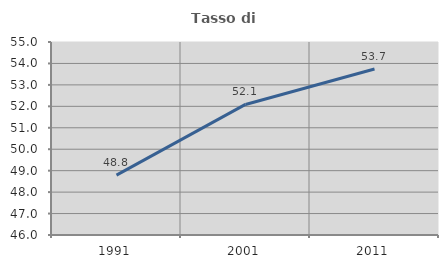
| Category | Tasso di occupazione   |
|---|---|
| 1991.0 | 48.794 |
| 2001.0 | 52.089 |
| 2011.0 | 53.739 |